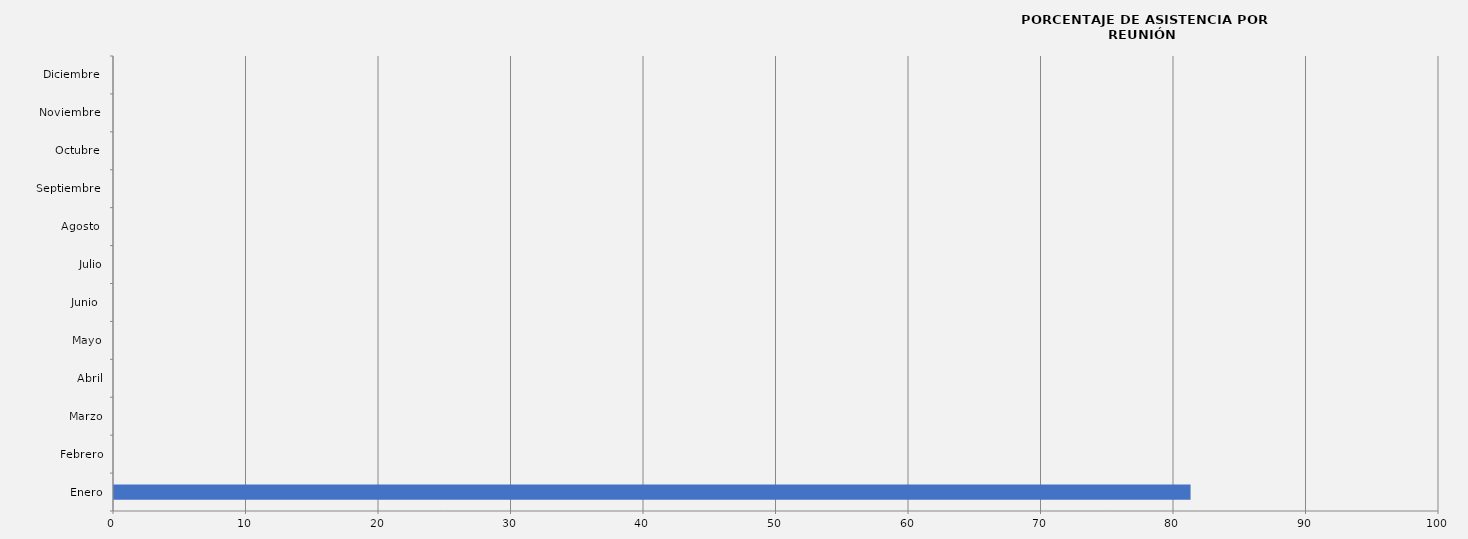
| Category | Series 0 |
|---|---|
| Enero | 81.25 |
| Febrero | 0 |
| Marzo | 0 |
| Abril | 0 |
| Mayo | 0 |
| Junio  | 0 |
| Julio | 0 |
| Agosto  | 0 |
| Septiembre  | 0 |
| Octubre  | 0 |
| Noviembre  | 0 |
| Diciembre  | 0 |